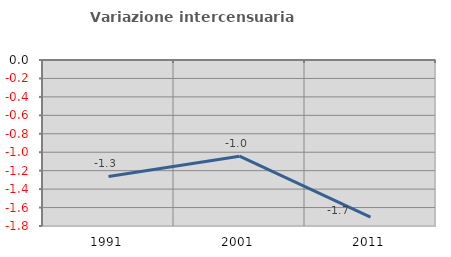
| Category | Variazione intercensuaria annua |
|---|---|
| 1991.0 | -1.263 |
| 2001.0 | -1.043 |
| 2011.0 | -1.704 |